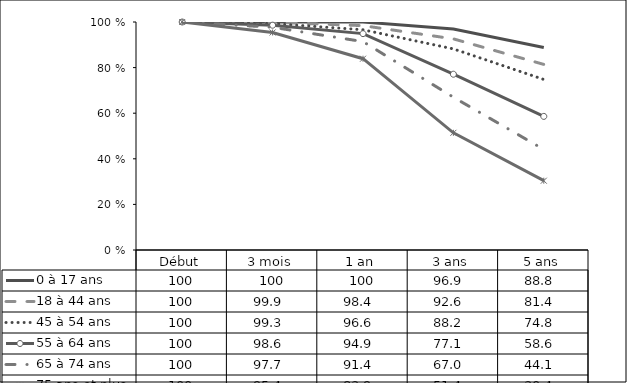
| Category | 0 à 17 ans | 18 à 44 ans  | 45 à 54 ans  | 55 à 64 ans  | 65 à 74 ans  | 75 ans et plus  |
|---|---|---|---|---|---|---|
| Début | 100 | 100 | 100 | 100 | 100 | 100 |
| 3 mois | 100 | 99.9 | 99.3 | 98.6 | 97.7 | 95.4 |
| 1 an | 100 | 98.4 | 96.6 | 94.9 | 91.4 | 83.9 |
| 3 ans | 96.9 | 92.6 | 88.2 | 77.1 | 67 | 51.4 |
| 5 ans | 88.8 | 81.4 | 74.8 | 58.6 | 44.1 | 30.4 |